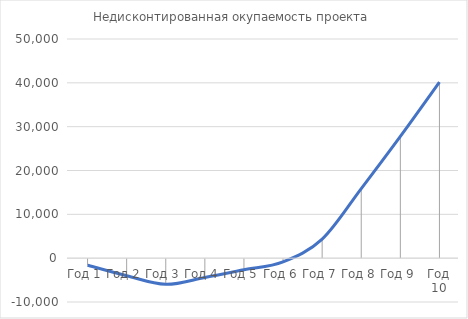
| Category | Недисконтированная окупаемость проекта |
|---|---|
| Год 1 | -1608 |
| Год 2 | -4018.682 |
| Год 3 | -5970.179 |
| Год 4 | -4402.576 |
| Год 5 | -2653.712 |
| Год 6 | -850.246 |
| Год 7 | 4336.069 |
| Год 8 | 15872.906 |
| Год 9 | 27782.486 |
| Год 10 | 40162.841 |